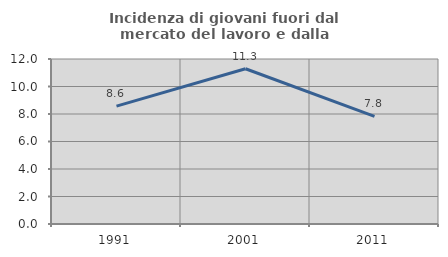
| Category | Incidenza di giovani fuori dal mercato del lavoro e dalla formazione  |
|---|---|
| 1991.0 | 8.575 |
| 2001.0 | 11.29 |
| 2011.0 | 7.83 |